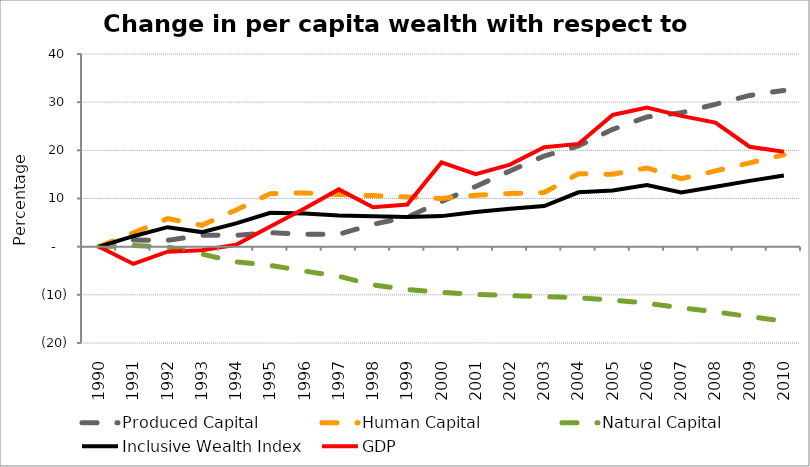
| Category | Produced Capital  | Human Capital | Natural Capital | Inclusive Wealth Index | GDP |
|---|---|---|---|---|---|
| 1990.0 | 0 | 0 | 0 | 0 | 0 |
| 1991.0 | 1.396 | 2.878 | 0.256 | 2.171 | -3.582 |
| 1992.0 | 1.286 | 5.818 | -0.066 | 4.049 | -1.044 |
| 1993.0 | 2.378 | 4.437 | -1.542 | 3.026 | -0.746 |
| 1994.0 | 2.353 | 7.619 | -3.171 | 4.837 | 0.406 |
| 1995.0 | 2.907 | 11.014 | -3.883 | 7.047 | 4.176 |
| 1996.0 | 2.551 | 11.153 | -5.064 | 6.868 | 7.916 |
| 1997.0 | 2.572 | 10.83 | -6.147 | 6.457 | 11.891 |
| 1998.0 | 4.64 | 10.6 | -7.931 | 6.29 | 8.18 |
| 1999.0 | 6.133 | 10.32 | -8.878 | 6.157 | 8.738 |
| 2000.0 | 9.381 | 10.023 | -9.485 | 6.341 | 17.501 |
| 2001.0 | 12.5 | 10.683 | -9.906 | 7.176 | 15.069 |
| 2002.0 | 15.728 | 11.048 | -10.159 | 7.861 | 17.032 |
| 2003.0 | 18.825 | 11.236 | -10.35 | 8.421 | 20.629 |
| 2004.0 | 20.897 | 15.138 | -10.624 | 11.278 | 21.332 |
| 2005.0 | 24.356 | 15.04 | -11.079 | 11.654 | 27.348 |
| 2006.0 | 26.919 | 16.343 | -11.749 | 12.786 | 28.907 |
| 2007.0 | 27.797 | 14.117 | -12.671 | 11.27 | 27.153 |
| 2008.0 | 29.556 | 15.724 | -13.538 | 12.446 | 25.764 |
| 2009.0 | 31.404 | 17.402 | -14.527 | 13.66 | 20.75 |
| 2010.0 | 32.439 | 19.081 | -15.428 | 14.766 | 19.705 |